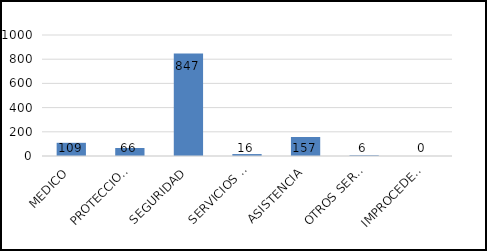
| Category | TOTAL |
|---|---|
| MEDICO | 109 |
| PROTECCION CIVIL | 66 |
| SEGURIDAD | 847 |
| SERVICIOS PUBLICOS | 16 |
| ASISTENCIA | 157 |
| OTROS SERVICIOS | 6 |
| IMPROCEDENTES | 0 |